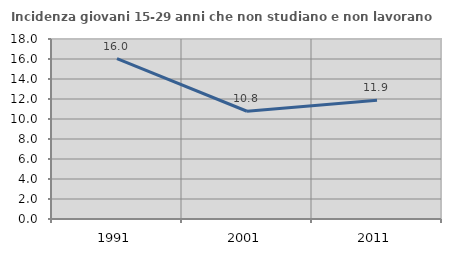
| Category | Incidenza giovani 15-29 anni che non studiano e non lavorano  |
|---|---|
| 1991.0 | 16.041 |
| 2001.0 | 10.774 |
| 2011.0 | 11.885 |